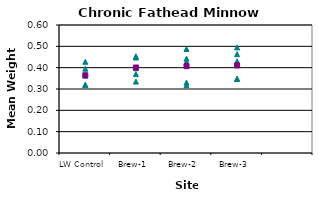
| Category | Indiv. Weight | FHM Weight Rep 2 | FHM Weight Rep 3 | FHM Weight Rep 4 | FHM Weight Rep 5 | Mean Weight |
|---|---|---|---|---|---|---|
| LW Control | 0.318 | 0.362 | 0.395 | 0.428 | 0.32 | 0.364 |
| Brew-1 | 0.448 | 0.335 | 0.37 | 0.398 | 0.453 | 0.401 |
| Brew-2 | 0.33 | 0.488 | 0.318 | 0.428 | 0.442 | 0.407 |
| Brew-3 | 0.463 | 0.43 | 0.348 | 0.495 | 0.348 | 0.411 |